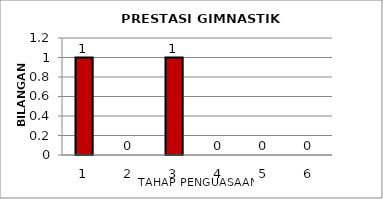
| Category | Series 0 |
|---|---|
| 1.0 | 1 |
| 2.0 | 0 |
| 3.0 | 1 |
| 4.0 | 0 |
| 5.0 | 0 |
| 6.0 | 0 |